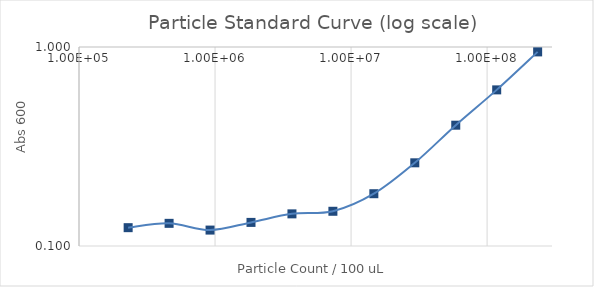
| Category | Series 1 |
|---|---|
| 235294117.64705887 | 0.945 |
| 117647058.82352944 | 0.609 |
| 58823529.41176472 | 0.405 |
| 29411764.70588236 | 0.262 |
| 14705882.35294118 | 0.183 |
| 7352941.17647059 | 0.149 |
| 3676470.588235295 | 0.145 |
| 1838235.2941176475 | 0.131 |
| 919117.6470588237 | 0.12 |
| 459558.82352941186 | 0.13 |
| 229779.41176470593 | 0.124 |